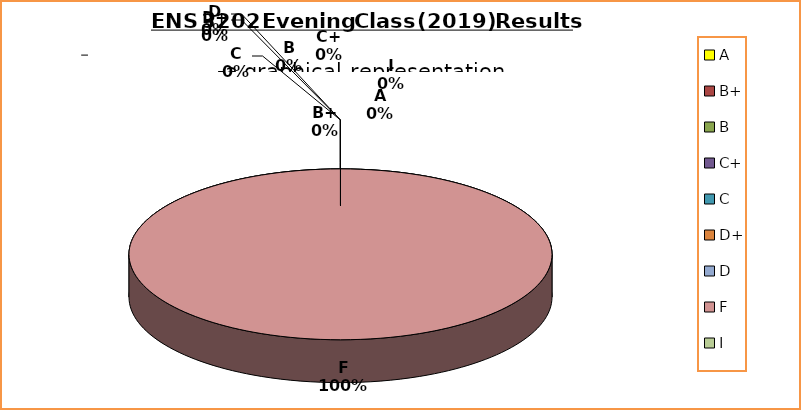
| Category | Series 0 |
|---|---|
| A | 0 |
| B+ | 0 |
| B | 0 |
| C+ | 0 |
| C | 0 |
| D+ | 0 |
| D | 0 |
| F | 6 |
| I | 0 |